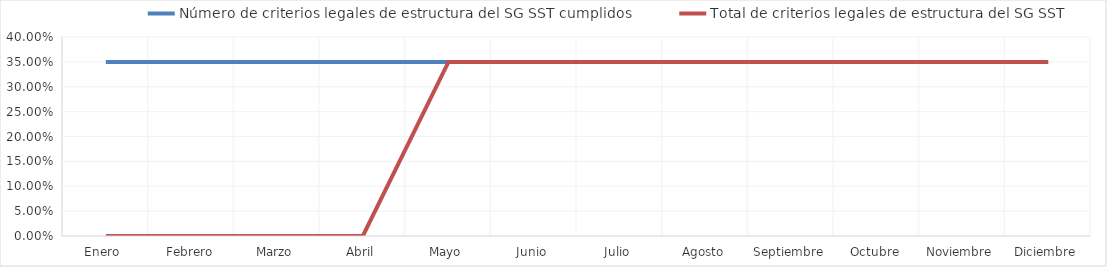
| Category | Número de criterios legales de estructura del SG SST cumplidos | Total de criterios legales de estructura del SG SST |
|---|---|---|
| Enero  | 0.35 | 0 |
| Febrero | 0.35 | 0 |
| Marzo | 0.35 | 0 |
| Abril | 0.35 | 0 |
| Mayo | 0.35 | 0.35 |
| Junio | 0.35 | 0.35 |
| Julio | 0.35 | 0.35 |
| Agosto | 0.35 | 0.35 |
| Septiembre | 0.35 | 0.35 |
| Octubre | 0.35 | 0.35 |
| Noviembre | 0.35 | 0.35 |
| Diciembre | 0.35 | 0.35 |